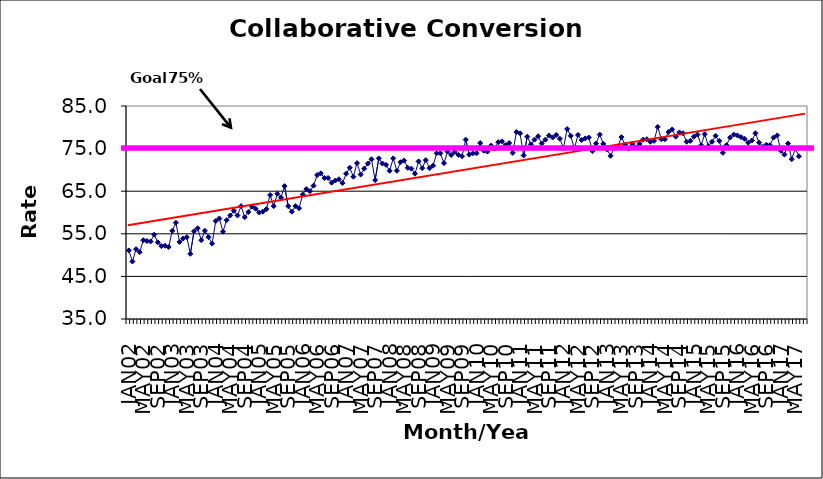
| Category | Series 0 |
|---|---|
| JAN02 | 51.1 |
| FEB02 | 48.5 |
| MAR02 | 51.4 |
| APR02 | 50.7 |
| MAY02 | 53.5 |
| JUN02 | 53.3 |
| JUL02 | 53.2 |
| AUG02 | 54.8 |
| SEP02 | 53 |
| OCT02 | 52.1 |
| NOV02 | 52.2 |
| DEC02 | 51.9 |
| JAN03 | 55.7 |
| FEB03 | 57.6 |
| MAR03 | 53.1 |
| APR03 | 53.9 |
| MAY03 | 54.2 |
| JUN03 | 50.3 |
| JUL03 | 55.6 |
| AUG03 | 56.3 |
| SEP03 | 53.5 |
| OCT03 | 55.7 |
| NOV03 | 54.2 |
| DEC03 | 52.7 |
| JAN04 | 58 |
| FEB04 | 58.6 |
| MAR04 | 55.5 |
| APR04 | 58.2 |
| MAY04 | 59.3 |
| JUN04 | 60.4 |
| JUL04 | 59.3 |
| AUG04 | 61.5 |
| SEP04 | 58.9 |
| OCT04 | 60.1 |
| NOV04 | 61.4 |
| DEC04 | 60.9 |
| JAN05 | 60 |
| FEB05 | 60.2 |
| MAR05 | 60.8 |
| APR05 | 64.1 |
| MAY05 | 61.5 |
| JUN05 | 64.4 |
| JUL05 | 63.5 |
| AUG05 | 66.2 |
| SEP05 | 61.5 |
| OCT05 | 60.2 |
| NOV05 | 61.5 |
| DEC05 | 61 |
| JAN06 | 64.2 |
| FEB06 | 65.5 |
| MAR06 | 65 |
| APR06 | 66.3 |
| MAY06 | 68.8 |
| JUN06 | 69.2 |
| JUL06 | 68.1 |
| AUG06 | 68.1 |
| SEP06 | 67 |
| OCT06 | 67.5 |
| NOV06 | 67.8 |
| DEC06 | 66.9 |
| JAN07 | 69.1 |
| FEB07 | 70.5 |
| MAR07 | 68.4 |
| APR07 | 71.6 |
| MAY07 | 68.9 |
| JUN07 | 70.3 |
| JUL07 | 71.5 |
| AUG07 | 72.5 |
| SEP07 | 67.6 |
| OCT07 | 72.7 |
| NOV07 | 71.5 |
| DEC07 | 71.2 |
| JAN08 | 69.8 |
| FEB08 | 72.7 |
| MAR08 | 69.8 |
| APR08 | 71.8 |
| MAY08 | 72.2 |
| JUN08 | 70.5 |
| JUL08 | 70.3 |
| AUG08 | 69.1 |
| SEP08 | 72 |
| OCT08 | 70.4 |
| NOV08 | 72.3 |
| DEC08 | 70.4 |
| JAN09 | 71 |
| FEB09 | 73.9 |
| MAR09 | 73.9 |
| APR09 | 71.6 |
| MAY09 | 74.3 |
| JUN09 | 73.5 |
| JUL09 | 74.2 |
| AUG09 | 73.5 |
| SEP09 | 73.2 |
| OCT09 | 77.1 |
| NOV09 | 73.6 |
| DEC09 | 73.9 |
| JAN10 | 73.9 |
| FEB10 | 76.3 |
| MAR10 | 74.5 |
| APR10 | 74.3 |
| MAY10 | 75.7 |
| JUN10 | 75 |
| JUL10 | 76.5 |
| AUG10 | 76.7 |
| SEP10 | 75.8 |
| OCT10 | 76.3 |
| NOV10 | 74 |
| DEC10 | 78.9 |
| JAN11 | 78.6 |
| FEB11 | 73.4 |
| MAR11 | 77.8 |
| APR11 | 76 |
| MAY11 | 77.1 |
| JUN11 | 77.9 |
| JUL11 | 76.2 |
| AUG11 | 77.1 |
| SEP11 | 78.1 |
| OCT11 | 77.6 |
| NOV11 | 78.2 |
| DEC11 | 77.3 |
| JAN12 | 75.1 |
| FEB12 | 79.6 |
| MAR12 | 78 |
| APR12 | 75 |
| MAY12 | 78.2 |
| JUN12 | 77 |
| JUL12 | 77.4 |
| AUG12 | 77.6 |
| SEP12 | 74.4 |
| OCT12 | 76.2 |
| NOV12 | 78.3 |
| DEC12 | 76.1 |
| JAN13 | 74.8 |
| FEB13 | 73.3 |
| MAR13 | 75.1 |
| APR13 | 75.5 |
| MAY13 | 77.7 |
| JUN13 | 75.9 |
| JUL13 | 75 |
| AUG13 | 76.1 |
| SEP13 | 75.3 |
| OCT13 | 76.1 |
| NOV13 | 77.1 |
| DEC13 | 77.2 |
| JAN14 | 76.6 |
| FEB14 | 76.8 |
| MAR14 | 80.1 |
| APR14 | 77.2 |
| MAY14 | 77.2 |
| JUN14 | 78.9 |
| JUL14 | 79.5 |
| AUG14 | 77.8 |
| SEP14 | 78.8 |
| OCT14 | 78.6 |
| NOV14 | 76.6 |
| DEC14 | 76.8 |
| JAN15 | 77.8 |
| FEB15 | 78.3 |
| MAR15 | 75.8 |
| APR15 | 78.4 |
| MAY15 | 75.6 |
| JUN15 | 76.6 |
| JUL15 | 78 |
| AUG15 | 76.8 |
| SEP15 | 74 |
| OCT15 | 75.8 |
| NOV15 | 77.6 |
| DEC15 | 78.3 |
| JAN16 | 78.1 |
| FEB16 | 77.7 |
| MAR16 | 77.3 |
| APR16 | 76.4 |
| MAY16 | 76.9 |
| JUN16 | 78.6 |
| JUL16 | 76.4 |
| AUG16 | 75.4 |
| SEP16 | 75.9 |
| OCT16 | 75.8 |
| NOV16 | 77.6 |
| DEC16 | 78.1 |
| JAN17 | 74.5 |
| FEB17 | 73.6 |
| MAR17 | 76.2 |
| APR17 | 72.5 |
| MAY17 | 75 |
| JUN17 | 73.2 |